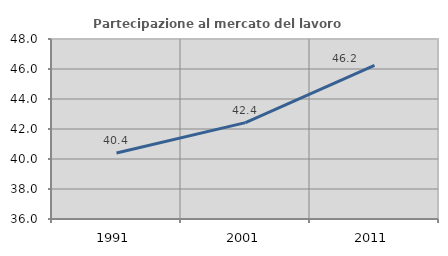
| Category | Partecipazione al mercato del lavoro  femminile |
|---|---|
| 1991.0 | 40.405 |
| 2001.0 | 42.424 |
| 2011.0 | 46.247 |